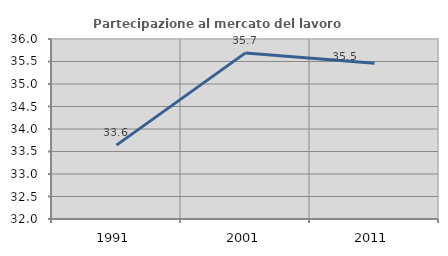
| Category | Partecipazione al mercato del lavoro  femminile |
|---|---|
| 1991.0 | 33.642 |
| 2001.0 | 35.691 |
| 2011.0 | 35.461 |